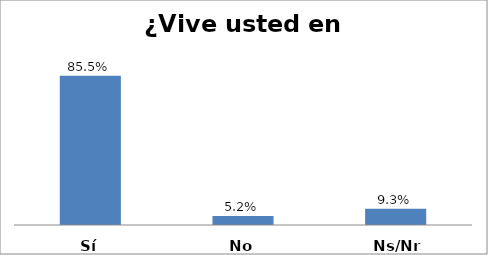
| Category | Series 0 |
|---|---|
| Sí | 0.855 |
| No | 0.052 |
| Ns/Nr | 0.093 |